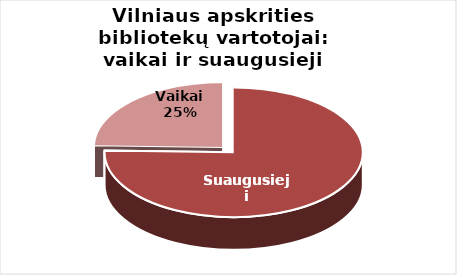
| Category | Series 0 |
|---|---|
| Suaugusieji | 72000 |
| Vaikai | 23470 |